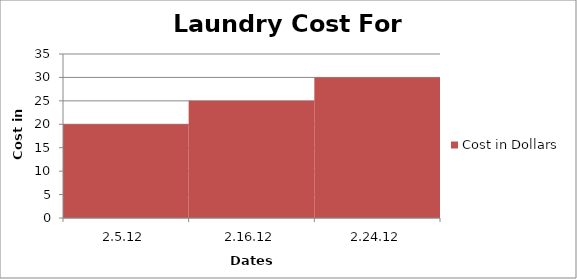
| Category | Cost in Dollars |
|---|---|
| 2.5.12 | 20 |
| 2.16.12 | 25 |
| 2.24.12 | 30 |